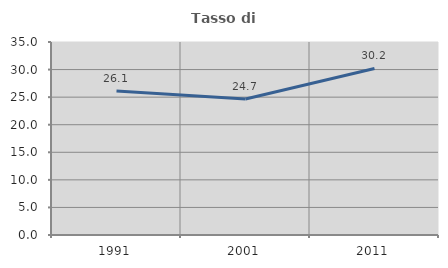
| Category | Tasso di occupazione   |
|---|---|
| 1991.0 | 26.107 |
| 2001.0 | 24.663 |
| 2011.0 | 30.208 |